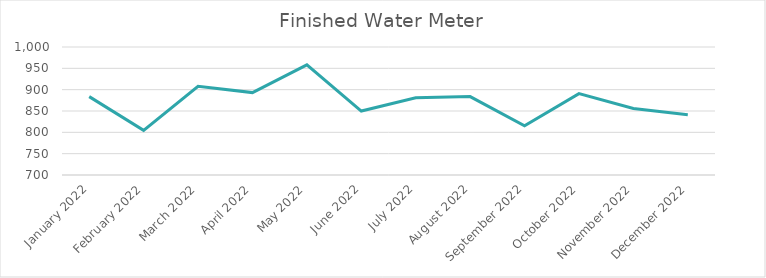
| Category | Series 0 |
|---|---|
| 2022-01-01 | 883.74 |
| 2022-02-01 | 804.7 |
| 2022-03-01 | 908.08 |
| 2022-04-01 | 893.14 |
| 2022-05-01 | 958.27 |
| 2022-06-01 | 849.87 |
| 2022-07-01 | 880.97 |
| 2022-08-01 | 883.84 |
| 2022-09-01 | 815.27 |
| 2022-10-01 | 890.67 |
| 2022-11-01 | 855.73 |
| 2022-12-01 | 841.13 |